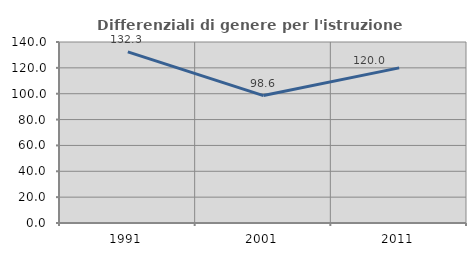
| Category | Differenziali di genere per l'istruzione superiore |
|---|---|
| 1991.0 | 132.34 |
| 2001.0 | 98.574 |
| 2011.0 | 119.987 |